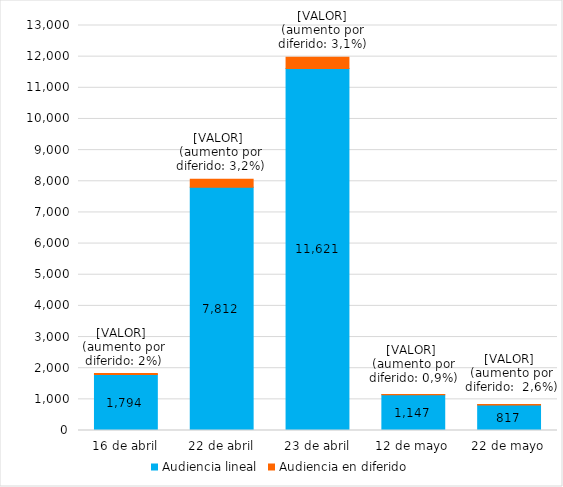
| Category | Audiencia lineal | Audiencia en diferido |
|---|---|---|
| 16 de abril | 1794 | 37 |
| 22 de abril | 7812 | 250 |
| 23 de abril | 11621 | 362 |
| 12 de mayo | 1147.381 | 10.112 |
| 22 de mayo | 817.031 | 21.102 |